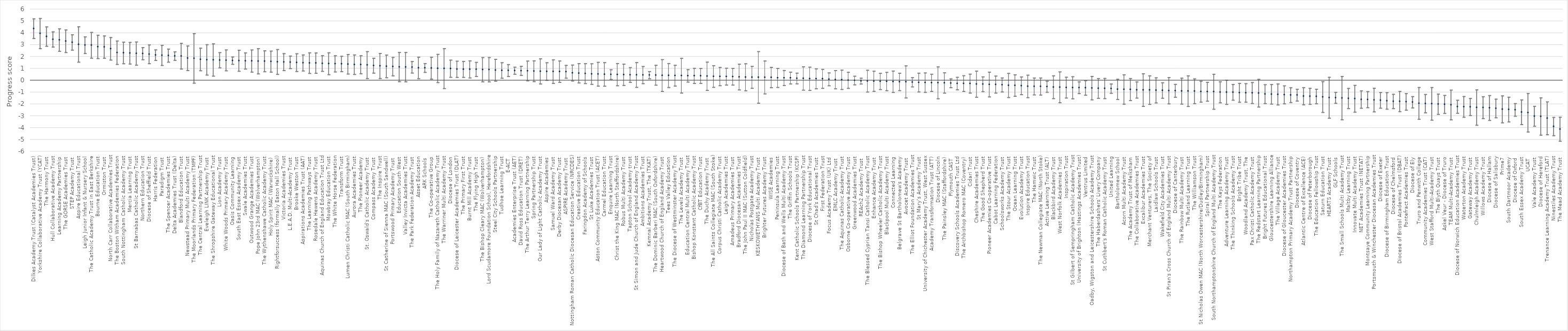
| Category | Series 0 | Series 1 | Series 2 |
|---|---|---|---|
| Dilkes Academy Trust (Catalyst Academies Trust) | 3.537 | 5.195 | 4.366 |
| Yorkshire Collaborative Academy Trust (YCAT) | 2.685 | 5.231 | 3.958 |
| The Harmony Trust | 2.884 | 4.518 | 3.701 |
| Hull Collaborative Academy Trust | 2.817 | 4.102 | 3.46 |
| Learning Academy Partnership | 2.462 | 4.36 | 3.411 |
| The GORSE Academies Trust | 2.355 | 4.26 | 3.308 |
| STEP Academy Trust | 2.56 | 3.852 | 3.206 |
| Aspire Educational Trust | 1.541 | 4.524 | 3.033 |
| Leigh Junior Infant & Nursery School | 2.271 | 3.676 | 2.973 |
| The Catholic Academy Trust in East Berkshire | 1.882 | 4.056 | 2.969 |
| Bourne Education Trust | 1.848 | 3.818 | 2.833 |
| Ormiston Trust | 1.878 | 3.754 | 2.816 |
| North Carr Collaborative Academies Trust | 1.72 | 3.617 | 2.668 |
| The Boston Witham Academies Federation | 1.352 | 3.33 | 2.341 |
| South Nottingham Catholic Academy Trust | 1.408 | 3.234 | 2.321 |
| Mercia Learning Trust | 1.389 | 3.209 | 2.299 |
| St Barnabas Catholic Academy Trust | 1.295 | 3.247 | 2.271 |
| Northern Education Trust | 1.752 | 2.771 | 2.262 |
| Diocese of Sheffield Trust | 1.413 | 3.001 | 2.207 |
| Harris Federation | 1.693 | 2.579 | 2.136 |
| Paradigm Trust | 1.265 | 2.96 | 2.113 |
| The Spencer Academies Trust | 1.541 | 2.649 | 2.095 |
| Delta Academies Trust (Delta) | 1.701 | 2.414 | 2.057 |
| Blandford Education Trust | 0.961 | 3.135 | 2.048 |
| Newstead Primary Multi Academy Trust | 0.835 | 2.914 | 1.875 |
| The Moorlands Primary Federation (TMPF) | -0.229 | 3.948 | 1.859 |
| The Central Learning Partnership Trust | 0.817 | 2.722 | 1.769 |
| Eveleigh LINK Academy Trust | 0.455 | 3.019 | 1.737 |
| The Shropshire Gateway Educational Trust | 0.363 | 3.091 | 1.727 |
| Lion Academy Trust | 1.064 | 2.348 | 1.706 |
| White Woods Primary Academy Trust | 0.813 | 2.576 | 1.695 |
| Oasis Community Learning | 1.359 | 1.982 | 1.671 |
| South East Essex Academy Trust | 0.775 | 2.55 | 1.663 |
| Swale Academies Trust | 0.958 | 2.327 | 1.642 |
| Outwood Grange Academies Trust | 0.707 | 2.575 | 1.641 |
| Pope John 23rd MAC (Wolverhampton) | 0.552 | 2.682 | 1.617 |
| The Wythenshawe Catholic Academy Trust | 0.735 | 2.498 | 1.616 |
| Holy Spirit MAC (Warwickshire) | 0.704 | 2.48 | 1.592 |
| Rightforsuccess (formally Eaton Hall School) | 0.511 | 2.61 | 1.56 |
| Victoria Academies Trust | 0.832 | 2.261 | 1.546 |
| L.E.A.D. Multi-Academy Trust | 0.998 | 2.061 | 1.529 |
| Brooke Weston Trust | 0.755 | 2.254 | 1.504 |
| Aspirations Academies Trust (AAT) | 0.803 | 2.153 | 1.478 |
| The Learning Pathways Trust | 0.594 | 2.333 | 1.463 |
| Rosedale Hewens Academy Trust | 0.607 | 2.318 | 1.462 |
| Aquinas Church of England Education Trust Ltd | 0.767 | 2.091 | 1.429 |
| Mowbray Education Trust | 0.488 | 2.335 | 1.412 |
| The White Horse Federation | 0.718 | 2.085 | 1.401 |
| Transform Trust | 0.742 | 2.04 | 1.391 |
| Lumen Christi Catholic MAC (South Birmingham) | 0.542 | 2.185 | 1.364 |
| Aurora Academies Trust | 0.504 | 2.153 | 1.329 |
| The Pioneer Academy | 0.568 | 2.086 | 1.327 |
| St. Oswald's Catholic Academy Trust | 0.163 | 2.434 | 1.299 |
| Compass Academy Trust | 0.621 | 1.874 | 1.247 |
| The Inspire Trust | 0.166 | 2.276 | 1.221 |
| St Catherine of Sienna MAC (South Sandwell) | 0.229 | 2.142 | 1.185 |
| Portswood Primary Academy Trust | 0.392 | 1.941 | 1.167 |
| Education South West | -0.099 | 2.361 | 1.131 |
| Valley Invicta Academies Trust | -0.117 | 2.359 | 1.121 |
| The Park Federation Academy Trust | 0.627 | 1.594 | 1.111 |
| Asset Education | 0.146 | 1.96 | 1.053 |
| ARK Schools | 0.68 | 1.425 | 1.053 |
| The Co-operative Group | 0.119 | 1.952 | 1.036 |
| The Holy Family of Nazareth Catholic Academy Trust | -0.179 | 2.202 | 1.011 |
| The Warriner Multi Academy Trust | -0.683 | 2.685 | 1.001 |
| Diocese of London | 0.267 | 1.717 | 0.992 |
| Diocese of Leicester Academies Trust (DLAT) | 0.26 | 1.626 | 0.943 |
| The Primary First Trust | 0.261 | 1.608 | 0.935 |
| Burnt Mill Academy Trust | 0.215 | 1.654 | 0.934 |
| The Flying High Trust | 0.334 | 1.529 | 0.932 |
| The Bishop Cleary MAC (Wolverhampton) | -0.118 | 1.932 | 0.907 |
| Lord Scudamore Foundation School, Herefordshire | -0.123 | 1.936 | 0.907 |
| Steel City Schools Partnership | -0.059 | 1.781 | 0.861 |
| Tudhoe Learning Trust | 0.187 | 1.495 | 0.841 |
| E-ACT | 0.333 | 1.34 | 0.837 |
| Academies Enterprise Trust (AET) | 0.525 | 1.123 | 0.824 |
| David Ross Education Trust (DRET) | 0.432 | 1.19 | 0.811 |
| The Arthur Terry Learning Partnership | -0.034 | 1.634 | 0.8 |
| Spring Partnership Trust | -0.095 | 1.656 | 0.78 |
| Our Lady of Light Catholic Academy Trust | -0.296 | 1.823 | 0.764 |
| Aspire Academies | 0.01 | 1.494 | 0.752 |
| Samuel Ward Academy Trust | -0.246 | 1.741 | 0.748 |
| Derby Diocesan Academy Trust | -0.159 | 1.641 | 0.741 |
| ASPIRE Academy Trust | 0.19 | 1.27 | 0.73 |
| Nottingham Roman Catholic Diocesan Education Service (NRCDES) | -0.045 | 1.302 | 0.628 |
| Creative Education Trust | -0.21 | 1.419 | 0.604 |
| Faringdon Academy of Schools | -0.265 | 1.414 | 0.575 |
| St Luke Academies Trust | -0.327 | 1.406 | 0.54 |
| Aston Community Education Trust (ACET) | -0.473 | 1.531 | 0.529 |
| Carmel Education Trust | -0.484 | 1.503 | 0.51 |
| Enquire Learning Trust | 0.091 | 0.904 | 0.497 |
| Christ the King MAC (North Staffordshire) | -0.447 | 1.428 | 0.491 |
| Robus Multi Academy Trust | -0.418 | 1.376 | 0.479 |
| Tapton School Academy trust | -0.156 | 1.084 | 0.464 |
| St Simon and Jude Church of England Academy Trust | -0.583 | 1.505 | 0.461 |
| Ambitions Academies Trust | -0.271 | 1.175 | 0.452 |
| Kemnal Academy Trust, The (TKAT) | 0.143 | 0.748 | 0.446 |
| The Dominic Barberi MAC (South Oxfordshire) | -0.397 | 1.276 | 0.439 |
| Heartwood Church of England Academy Trust | -0.924 | 1.76 | 0.418 |
| Tees Valley Education | -0.593 | 1.429 | 0.418 |
| The Diocese of Westminster Academy Trust | -0.468 | 1.277 | 0.404 |
| The Levels Academy Trust | -1.062 | 1.864 | 0.401 |
| Education Central Multi Academy Trust | -0.136 | 0.912 | 0.388 |
| Bishop Konstant Catholic Academy Trust | -0.25 | 1.025 | 0.387 |
| CfBT Education Trust | -0.245 | 1.01 | 0.383 |
| The Duchy Academy Trust | -0.836 | 1.546 | 0.355 |
| The All Saints Collegiate MAC (South Stoke) | -0.58 | 1.247 | 0.333 |
| Corpus Christi Catholic Academy Trust | -0.442 | 1.095 | 0.326 |
| Leigh Academies Trust | -0.39 | 1.033 | 0.322 |
| Amadeus Primary Academies Trust | -0.39 | 1.018 | 0.314 |
| Bradford Diocesan Academies Trust | -0.8 | 1.374 | 0.287 |
| The John Paul II MAC (Sutton Coldfield) | -0.865 | 1.406 | 0.27 |
| Nicholas Postgate Academy Trust | -0.661 | 1.186 | 0.263 |
| KESKOWETHYANS Multi Academy Trust | -1.914 | 2.434 | 0.26 |
| Brighter Futures Academy Trust | -1.133 | 1.641 | 0.254 |
| WISE Academies | -0.607 | 1.104 | 0.249 |
| Peninsula Learning Trust | -0.589 | 1.012 | 0.211 |
| Diocese of Bath and Wells Multi Academy Trust | -0.424 | 0.842 | 0.209 |
| The Griffin Schools Trust | -0.289 | 0.702 | 0.206 |
| Kent Catholic Schools Partnership (KCSP) | -0.281 | 0.62 | 0.169 |
| The Diamond Learning Partnership Trust | -0.817 | 1.152 | 0.168 |
| Diocese of York Educational Trust | -0.837 | 1.124 | 0.144 |
| St Chad's Academies Trust | -0.703 | 0.981 | 0.139 |
| First Federation Trust | -0.666 | 0.935 | 0.134 |
| Focus Academy Trust (UK) Ltd | -0.447 | 0.637 | 0.095 |
| EMLC Academy Trust | -0.707 | 0.835 | 0.064 |
| The Aquinas Catholic Academy Trust | -0.762 | 0.867 | 0.053 |
| Osborne Co-operative Academy Trust | -0.666 | 0.686 | 0.01 |
| Greenwood Academies Trust | -0.369 | 0.359 | -0.005 |
| REAch2 Academy Trust | -0.301 | 0.191 | -0.055 |
| The Blessed Cyprian Tansi Catholic Academy Trust | -0.979 | 0.861 | -0.059 |
| Enhance Academy Trust | -0.918 | 0.777 | -0.071 |
| The Bishop Wheeler Catholic Academy Trust | -0.768 | 0.602 | -0.083 |
| Blackpool Multi Academy Trust | -0.859 | 0.682 | -0.089 |
| Connected Learning | -1.007 | 0.794 | -0.106 |
| Belgrave St Bartholomew's Academy | -0.858 | 0.612 | -0.123 |
| Avocet Academy Trust | -1.477 | 1.228 | -0.124 |
| The Elliot Foundation Academies Trust | -0.543 | 0.237 | -0.153 |
| St Mary’s Academy Trust | -0.967 | 0.616 | -0.176 |
| University of Chichester Academy Trust, West Sussex | -1.003 | 0.636 | -0.184 |
| Academy Transformation Trust (ATT) | -0.924 | 0.528 | -0.198 |
| Diocese of Lincoln | -1.542 | 1.142 | -0.2 |
| The Painsley MAC (Staffordshire) | -1.072 | 0.645 | -0.214 |
| Plymouth CAST | -0.607 | 0.137 | -0.235 |
| Discovery Schools Academies Trust Ltd | -0.789 | 0.268 | -0.261 |
| The Archbishop Romero MAC (Coventry) | -0.924 | 0.402 | -0.261 |
| Cidari Trust | -1.067 | 0.534 | -0.266 |
| Cheshire Academies Trust | -1.412 | 0.785 | -0.314 |
| The Good Shepherd Trust | -0.943 | 0.304 | -0.32 |
| Pioneer Academies Co-operative Trust | -1.391 | 0.698 | -0.346 |
| Cabot Learning Federation | -1.067 | 0.369 | -0.349 |
| Schoolsworks Academy Trust | -0.966 | 0.214 | -0.376 |
| The Stour Academy Trust | -1.444 | 0.596 | -0.424 |
| Ocean Learning Trust | -1.331 | 0.476 | -0.428 |
| Evolution Academy Trust | -1.2 | 0.295 | -0.452 |
| Inspire Education Trust | -1.45 | 0.448 | -0.501 |
| The Hamwic Trust | -1.219 | 0.207 | -0.506 |
| The Newman Collegiate MAC (North Stoke) | -1.228 | 0.208 | -0.51 |
| Active Learning Trust (ALT) | -0.996 | -0.058 | -0.527 |
| Blackbird Academy Trust | -1.534 | 0.394 | -0.57 |
| West Norfolk Academies Trust | -1.879 | 0.724 | -0.578 |
| Inspiration Trust | -1.484 | 0.273 | -0.605 |
| St Gilbert of Sempringham Catholic Academy Trust | -1.544 | 0.317 | -0.613 |
| University of Brighton (Hastings Academies Trust) | -1.111 | -0.123 | -0.617 |
| Ventrus Limited | -1.238 | -0.02 | -0.629 |
| Oadby, Wigston and Leicestershire Schools Academy Trust | -1.633 | 0.336 | -0.648 |
| The Haberdashers' Livery Company | -1.507 | 0.162 | -0.672 |
| St Cuthbert's Roman Catholic Academy Trust | -1.532 | 0.174 | -0.679 |
| United Learning | -1.084 | -0.304 | -0.694 |
| Bartholomew School | -1.606 | 0.1 | -0.753 |
| Acorn Multi Academy Trust | -1.999 | 0.478 | -0.76 |
| The Academy Trust of Melksham | -1.698 | 0.163 | -0.767 |
| The Collaborative Academies Trust | -1.487 | -0.126 | -0.807 |
| Excalibur Academies Trust | -2.186 | 0.564 | -0.811 |
| Merchant Venturers, The Society of | -2.02 | 0.392 | -0.814 |
| Laidlaw Schools Trust | -1.893 | 0.227 | -0.833 |
| Wakefield City Academies Trust | -1.5 | -0.191 | -0.845 |
| St Piran's Cross Church of England Multi Academy Trust | -1.978 | 0.243 | -0.867 |
| Diocese of Canterbury | -1.417 | -0.328 | -0.872 |
| The Rainbow Multi Academy Trust | -1.993 | 0.192 | -0.901 |
| The Rutland Learning Trust | -2.194 | 0.39 | -0.902 |
| The Williamson Trust | -1.953 | 0.135 | -0.909 |
| St Nicholas Owen MAC (North Worcestershire/Dudley/Birmingham) | -1.828 | -0.059 | -0.943 |
| Spiral Partnership Trust | -1.751 | -0.154 | -0.953 |
| South Northamptonshire Church of England Multi Academy Trust | -2.43 | 0.524 | -0.953 |
| The Keys Federation | -1.885 | -0.11 | -0.998 |
| Adventure Learning Academy Trust | -2.021 | 0.02 | -1.001 |
| The Thinking Schools Academy Trust | -1.666 | -0.343 | -1.004 |
| Bright Tribe Trust | -1.84 | -0.248 | -1.044 |
| Woodland Academy Trust, The | -1.834 | -0.268 | -1.051 |
| Pax Christi Catholic Academy Trust | -1.943 | -0.174 | -1.058 |
| The Redstart Learning Partnership | -2.244 | 0.094 | -1.075 |
| Bright Futures Educational Trust | -1.949 | -0.357 | -1.153 |
| Gloucestershire Learning Alliance | -1.993 | -0.344 | -1.168 |
| The Village Academy Trust | -2.069 | -0.3 | -1.185 |
| Diocese of Gloucester Academies Trust | -1.974 | -0.452 | -1.213 |
| Northampton Primary Academy Trust Partnership | -1.862 | -0.617 | -1.239 |
| Diocese of Coventry | -1.741 | -0.739 | -1.24 |
| Atlantic Centre of Excellence (ACE) | -2.058 | -0.605 | -1.331 |
| Diocese of Peterborough | -2.017 | -0.667 | -1.342 |
| The Education Fellowship Trust | -1.97 | -0.74 | -1.355 |
| Saturn Education Trust | -2.7 | -0.098 | -1.399 |
| HEARTS Academy Trust | -3.186 | 0.269 | -1.458 |
| GLF Schools | -1.927 | -1.006 | -1.466 |
| The Small Schools Multi Academy Trust | -3.321 | 0.333 | -1.494 |
| Maltby Learning Trust | -2.377 | -0.672 | -1.525 |
| Innovate Multi Academy Trust | -2.671 | -0.413 | -1.542 |
| NET Academies Trust (NETAT) | -2.346 | -0.876 | -1.611 |
| Montsaye Community Learning Partnership | -2.298 | -0.942 | -1.62 |
| Portsmouth & Winchester Diocesan Academies Trust | -2.652 | -0.657 | -1.654 |
| Diocese of Exeter | -2.34 | -1.019 | -1.68 |
| Diocese of Birmingham Education Trust | -2.424 | -1.031 | -1.728 |
| Diocese of Chelmsford | -2.38 | -1.168 | -1.774 |
| Diocese of Bristol Academies Trust (DBAT) | -2.627 | -0.921 | -1.774 |
| Pontefract Academies Trust | -2.503 | -1.111 | -1.807 |
| Diocese of Ely | -2.313 | -1.36 | -1.836 |
| Truro and Penwith College | -3.277 | -0.593 | -1.935 |
| Community Academies Trust (CAT) | -2.734 | -1.18 | -1.957 |
| West Stafford Multi-Academy Trust | -3.345 | -0.595 | -1.97 |
| The Blyth Quays Trust | -2.859 | -1.148 | -2.004 |
| Askel Veur - Diocese of Truro | -2.783 | -1.262 | -2.022 |
| TEAM Multi-Academy Trust | -3.324 | -0.813 | -2.069 |
| Diocese of Norwich Education Academies Trust | -2.766 | -1.667 | -2.217 |
| Waterton Academy Trust | -3.104 | -1.353 | -2.228 |
| Gateway Academy Trust | -2.965 | -1.518 | -2.241 |
| Chulmleigh Academy Trust | -3.779 | -0.796 | -2.288 |
| Willows Academy Trust | -3.214 | -1.374 | -2.294 |
| Diocese of Hallam | -3.372 | -1.273 | -2.322 |
| Diocese of Salisbury | -3.15 | -1.575 | -2.362 |
| Prime7 | -3.573 | -1.302 | -2.437 |
| South Dartmoor Academy | -3.5 | -1.411 | -2.456 |
| Diocese of Oxford | -3.02 | -1.948 | -2.484 |
| South Essex Academy Trust | -3.721 | -1.642 | -2.681 |
| UCAT | -4.348 | -1.099 | -2.723 |
| Vale Academy Trust | -3.865 | -2.18 | -3.022 |
| Diocese of Hereford | -4.613 | -1.472 | -3.042 |
| Trenance Learning Academy Trust (TLAT) | -4.579 | -1.806 | -3.193 |
| Ninestiles Academy Trust | -4.657 | -3.116 | -3.887 |
| The Mead Academy Trust | -5.128 | -3.106 | -4.117 |